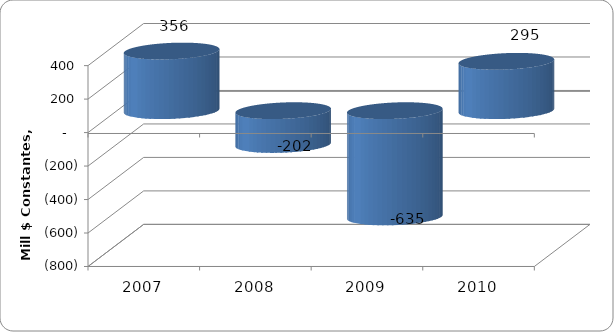
| Category | SALDO DE DEUDA |
|---|---|
| 2007 | 356.127 |
| 2008 | -202.019 |
| 2009 | -634.682 |
| 2010 | 294.842 |